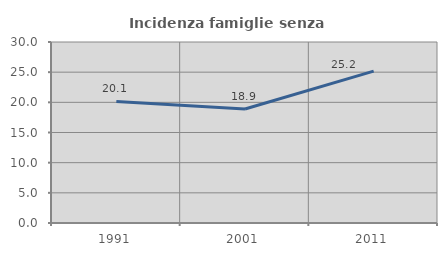
| Category | Incidenza famiglie senza nuclei |
|---|---|
| 1991.0 | 20.14 |
| 2001.0 | 18.888 |
| 2011.0 | 25.17 |